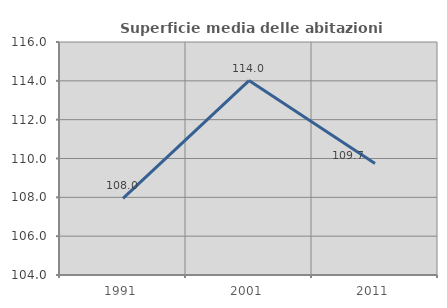
| Category | Superficie media delle abitazioni occupate |
|---|---|
| 1991.0 | 107.95 |
| 2001.0 | 114.014 |
| 2011.0 | 109.748 |